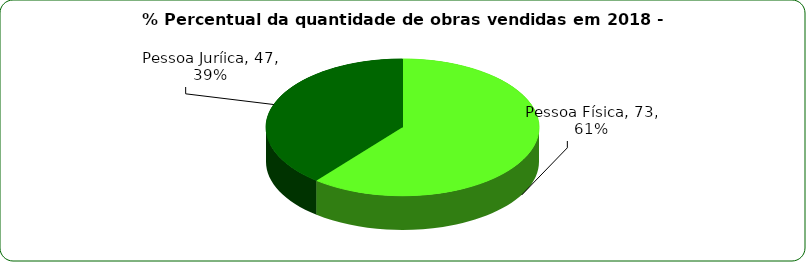
| Category | Series 0 |
|---|---|
| Pessoa Física | 73 |
| Pessoa Juríica | 47 |